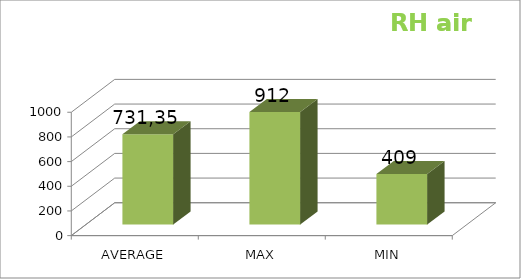
| Category | Series 0 |
|---|---|
| AVERAGE | 731.357 |
| MAX | 912 |
| MIN | 409 |